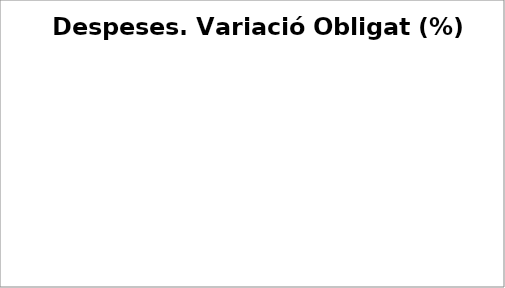
| Category | Series 0 |
|---|---|
| Despeses de personal | 0.039 |
| Despeses en béns corrents i serveis | 0.03 |
| Despeses financeres | -0.645 |
| Transferències corrents | 0.156 |
| Fons de contingència | 0 |
| Inversions reals | -0.034 |
| Transferències de capital | 3.701 |
| Actius financers | 0.39 |
| Passius financers | 0.002 |